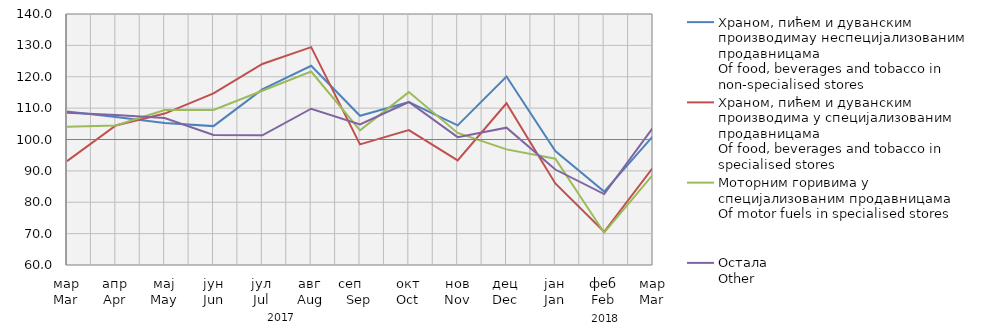
| Category | Храном, пићем и дуванским производимау неспецијализованим продавницама
Of food, beverages and tobacco in non-specialised stores
 | Храном, пићем и дуванским производима у специјализовaним продавницама
Of food, beverages and tobacco in specialised stores | Моторним горивима у специјализованим продавницама
Of motor fuels in specialised stores | Остала
Other |
|---|---|---|---|---|
| мар
Mar | 108.958 | 93.097 | 104.046 | 108.518 |
| апр
Apr | 107.187 | 104.456 | 104.458 | 107.78 |
| мај
May | 105.292 | 108.265 | 109.385 | 106.843 |
| јун
Jun | 104.266 | 114.686 | 109.425 | 101.464 |
| јул
Jul | 115.952 | 124.078 | 115.551 | 101.353 |
| авг
Aug | 123.494 | 129.435 | 121.673 | 109.807 |
| сеп     Sep | 107.568 | 98.457 | 102.908 | 104.789 |
| окт
Oct | 111.938 | 102.999 | 115.109 | 111.951 |
| нов
Nov | 104.514 | 93.335 | 102.083 | 100.762 |
| дец
Dec | 120.059 | 111.537 | 96.853 | 103.773 |
| јан
Jan | 96.298 | 85.996 | 93.873 | 90.431 |
| феб
Feb | 83.4 | 70.6 | 70.3 | 82.6 |
| мар
Mar | 101.078 | 91.052 | 88.818 | 103.76 |